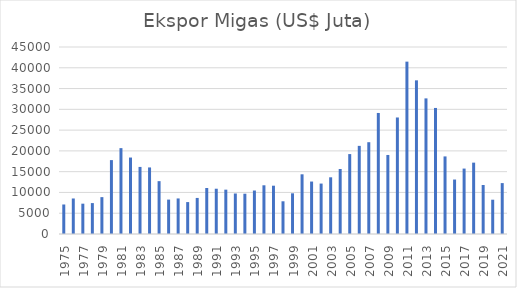
| Category | Ekspor Migas (US$ Juta) |
|---|---|
| 1975.0 | 7102.5 |
| 1976.0 | 8546.5 |
| 1977.0 | 7297.8 |
| 1978.0 | 7438.5 |
| 1979.0 | 8870.9 |
| 1980.0 | 17781.6 |
| 1981.0 | 20663.2 |
| 1982.0 | 18399.3 |
| 1983.0 | 16140.7 |
| 1984.0 | 16018.1 |
| 1985.0 | 12717.8 |
| 1986.0 | 8276.6 |
| 1987.0 | 8556 |
| 1988.0 | 7681.6 |
| 1989.0 | 8678.8 |
| 1990.0 | 11071.1 |
| 1991.0 | 10894.9 |
| 1992.0 | 10670.9 |
| 1993.0 | 9745.9 |
| 1994.0 | 9693.6 |
| 1995.0 | 10464.5 |
| 1996.0 | 11722 |
| 1997.0 | 11622.6 |
| 1998.0 | 7872.1 |
| 1999.0 | 9792.3 |
| 2000.0 | 14366.6 |
| 2001.0 | 12621.6 |
| 2002.0 | 12135.9 |
| 2003.0 | 13643.7 |
| 2004.0 | 15645.3 |
| 2005.0 | 19231.5 |
| 2006.0 | 21209.4 |
| 2007.0 | 22088.6 |
| 2008.0 | 29126.2 |
| 2009.0 | 19018.3 |
| 2010.0 | 28039.6 |
| 2011.0 | 41477.1 |
| 2012.0 | 36977.2 |
| 2013.0 | 32633.2 |
| 2014.0 | 30331.9 |
| 2015.0 | 18669.9 |
| 2016.0 | 13105.3 |
| 2017.0 | 15744.4 |
| 2018.0 | 17171.7 |
| 2019.0 | 11789.3 |
| 2020.0 | 8251.1 |
| 2021.0 | 12247.4 |